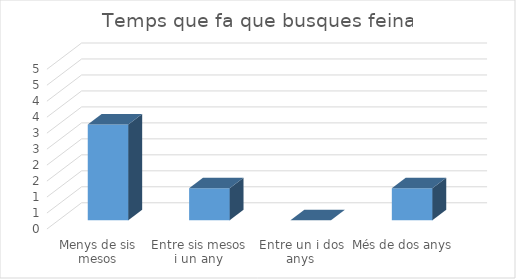
| Category | Series 0 |
|---|---|
| Menys de sis mesos | 3 |
| Entre sis mesos i un any | 1 |
| Entre un i dos anys | 0 |
| Més de dos anys | 1 |